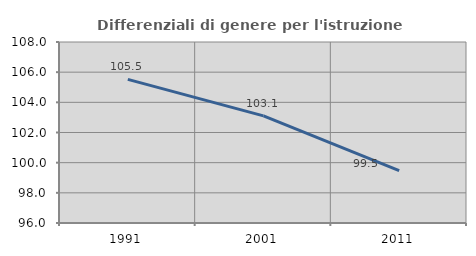
| Category | Differenziali di genere per l'istruzione superiore |
|---|---|
| 1991.0 | 105.524 |
| 2001.0 | 103.101 |
| 2011.0 | 99.469 |